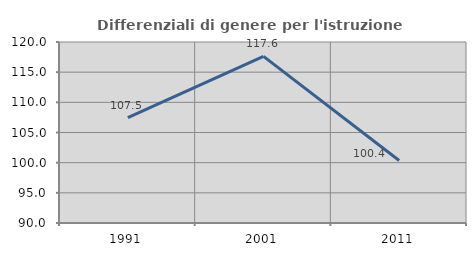
| Category | Differenziali di genere per l'istruzione superiore |
|---|---|
| 1991.0 | 107.453 |
| 2001.0 | 117.617 |
| 2011.0 | 100.352 |